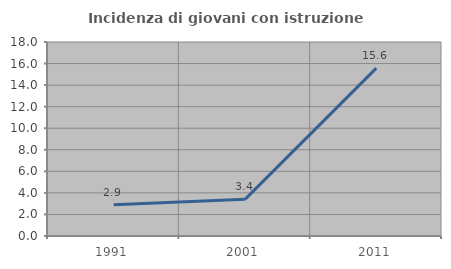
| Category | Incidenza di giovani con istruzione universitaria |
|---|---|
| 1991.0 | 2.91 |
| 2001.0 | 3.403 |
| 2011.0 | 15.58 |